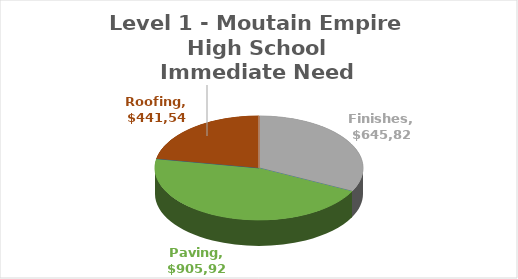
| Category | Series 0 |
|---|---|
| Electrical | 0 |
| Fencing | 0 |
| Finishes | 645827.65 |
| HVAC | 0 |
| LowVoltage | 0 |
| Paving | 905920.85 |
| Plumbing | 0 |
| Roofing | 441545.5 |
| Playground | 0 |